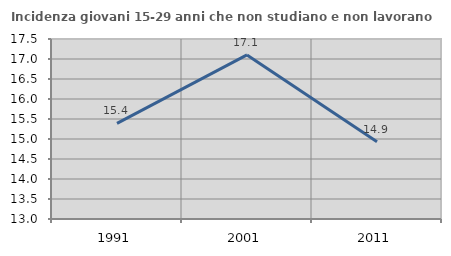
| Category | Incidenza giovani 15-29 anni che non studiano e non lavorano  |
|---|---|
| 1991.0 | 15.389 |
| 2001.0 | 17.101 |
| 2011.0 | 14.932 |